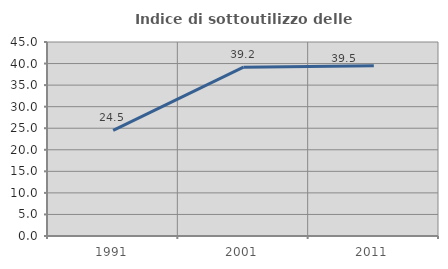
| Category | Indice di sottoutilizzo delle abitazioni  |
|---|---|
| 1991.0 | 24.499 |
| 2001.0 | 39.161 |
| 2011.0 | 39.485 |